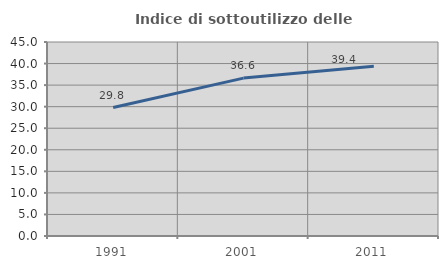
| Category | Indice di sottoutilizzo delle abitazioni  |
|---|---|
| 1991.0 | 29.8 |
| 2001.0 | 36.628 |
| 2011.0 | 39.389 |